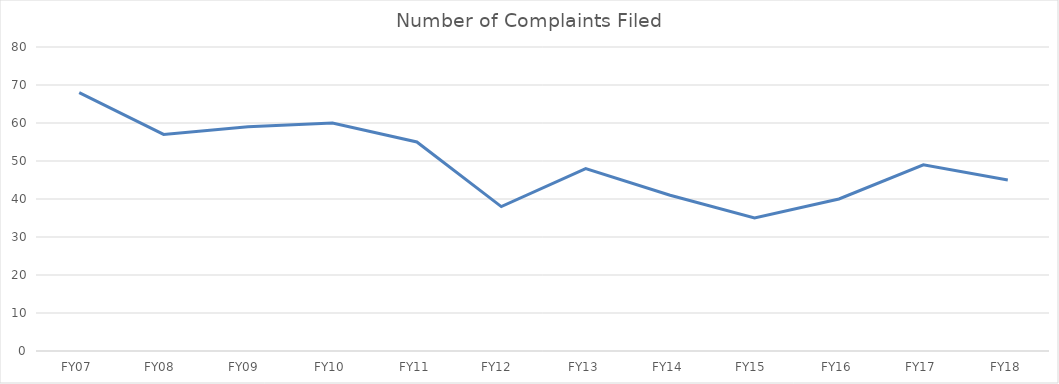
| Category | Number of Complaints Filed |
|---|---|
| FY07 | 68 |
| FY08  | 57 |
| FY09  | 59 |
| FY10 | 60 |
| FY11 | 55 |
| FY12  | 38 |
| FY13 | 48 |
| FY14 | 41 |
| FY15  | 35 |
| FY16 | 40 |
| FY17 | 49 |
| FY18 | 45 |